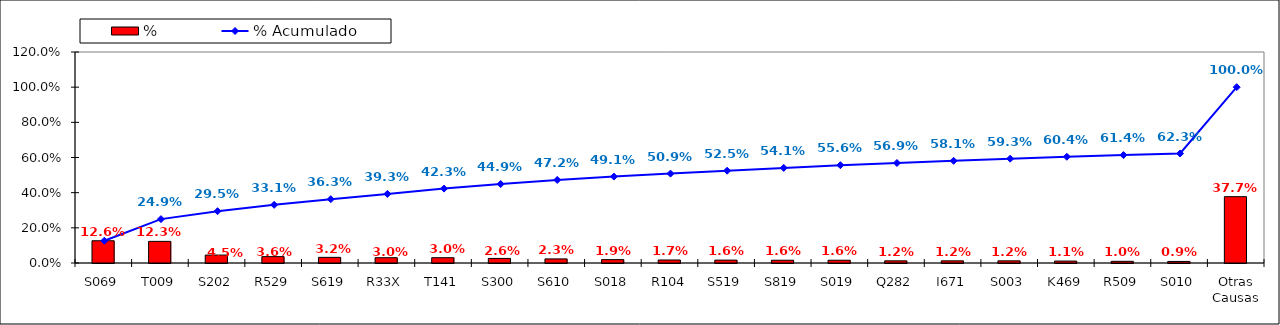
| Category | % |
|---|---|
| S069 | 0.126 |
| T009 | 0.123 |
| S202 | 0.045 |
| R529 | 0.036 |
| S619 | 0.032 |
| R33X | 0.03 |
| T141 | 0.03 |
| S300 | 0.026 |
| S610 | 0.023 |
| S018 | 0.019 |
| R104 | 0.017 |
| S519 | 0.016 |
| S819 | 0.016 |
| S019 | 0.016 |
| Q282 | 0.012 |
| I671 | 0.012 |
| S003 | 0.012 |
| K469 | 0.011 |
| R509 | 0.01 |
| S010 | 0.009 |
| Otras Causas | 0.377 |